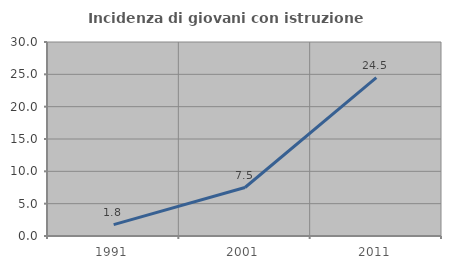
| Category | Incidenza di giovani con istruzione universitaria |
|---|---|
| 1991.0 | 1.754 |
| 2001.0 | 7.5 |
| 2011.0 | 24.49 |